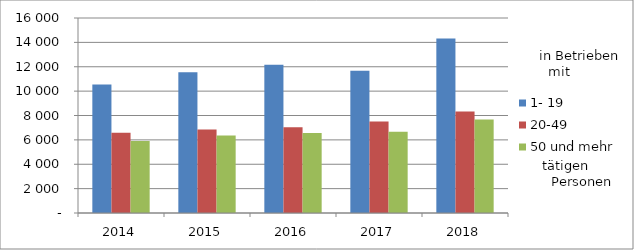
| Category | 1- 19 | 20-49 | 50 und mehr |
|---|---|---|---|
| 2014.0 | 10551 | 6588 | 5913 |
| 2015.0 | 11550 | 6857 | 6353 |
| 2016.0 | 12159 | 7039 | 6566 |
| 2017.0 | 11682 | 7507 | 6671 |
| 2018.0 | 14315 | 8321 | 7663 |